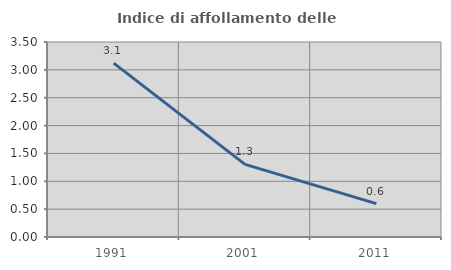
| Category | Indice di affollamento delle abitazioni  |
|---|---|
| 1991.0 | 3.121 |
| 2001.0 | 1.303 |
| 2011.0 | 0.599 |